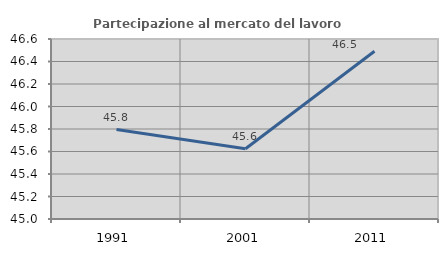
| Category | Partecipazione al mercato del lavoro  femminile |
|---|---|
| 1991.0 | 45.795 |
| 2001.0 | 45.625 |
| 2011.0 | 46.491 |